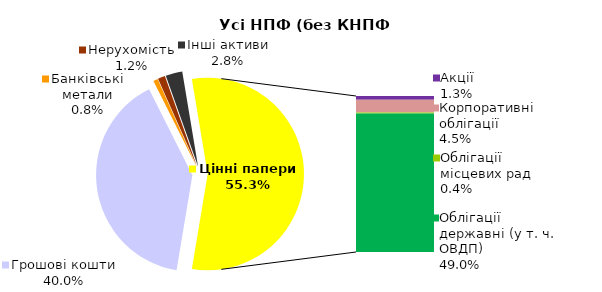
| Category | Усі НПФ (без КНПФ НБУ) |
|---|---|
| Грошові кошти | 1067.988 |
| Банківські метали | 20.327 |
| Нерухомість | 32.61 |
| Інші активи | 75.073 |
| Акції | 34.579 |
| Корпоративні облігації | 121.026 |
| Облігації місцевих рад | 11.123 |
| Облігації державні (у т. ч. ОВДП) | 1310.312 |